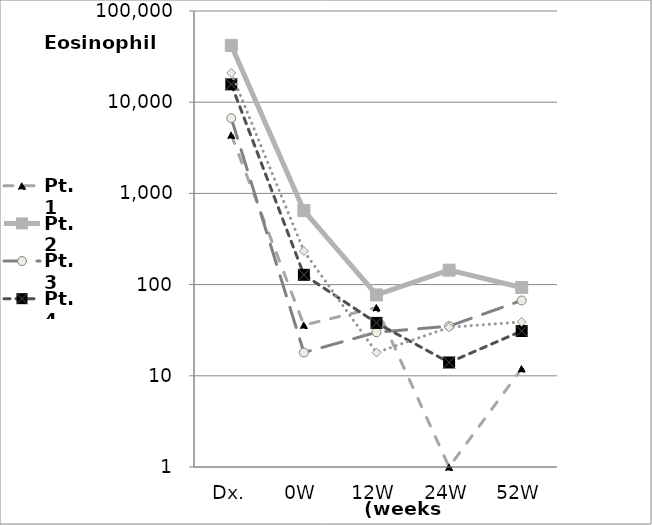
| Category | Pt.1 | Pt.2 | Pt.3 | Pt.4 | Pt.5 |
|---|---|---|---|---|---|
| Dx. | 4369 | 41960 | 6673 | 15695 | 20882 |
| 0W | 36 | 648 | 18 | 128 | 233 |
| 12W | 56 | 77 | 30 | 38 | 18 |
| 24W | 1 | 144 | 35 | 14 | 34 |
| 52W | 12 | 93 | 67 | 31 | 39 |